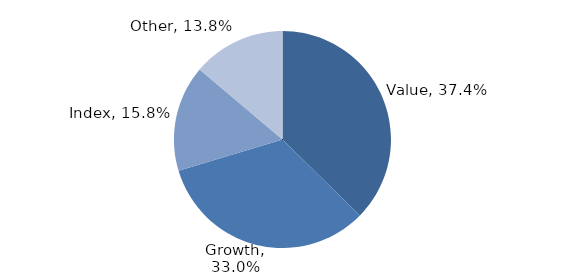
| Category | Investment Style |
|---|---|
| Value | 0.374 |
| Growth | 0.33 |
| Index | 0.158 |
| Other | 0.138 |